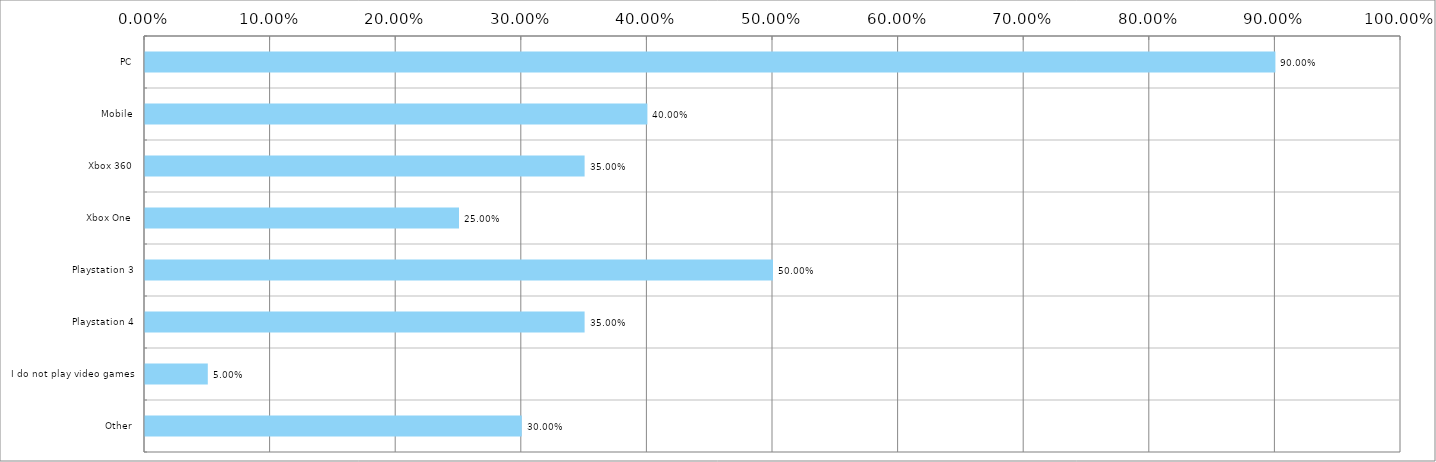
| Category | Total (% & freq col) |
|---|---|
| PC | 0.9 |
| Mobile | 0.4 |
| Xbox 360 | 0.35 |
| Xbox One | 0.25 |
| Playstation 3 | 0.5 |
| Playstation 4 | 0.35 |
| I do not play video games | 0.05 |
| Other | 0.3 |